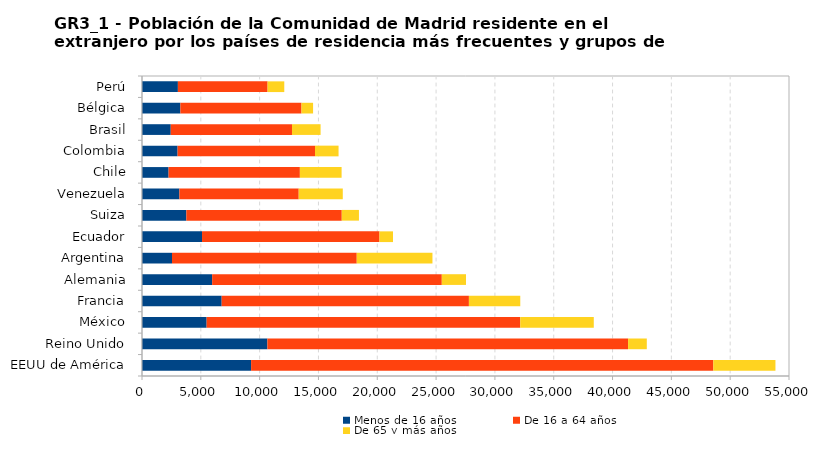
| Category | Menos de 16 años | De 16 a 64 años | De 65 y más años |
|---|---|---|---|
| EEUU de América | 9274 | 39294 | 5280 |
|     Reino Unido | 10660 | 30661 | 1591 |
|     México | 5495 | 26661 | 6249 |
|     Francia | 6774 | 21016 | 4366 |
|     Alemania | 5963 | 19522 | 2058 |
|     Argentina | 2549 | 15707 | 6435 |
|     Ecuador | 5102 | 15086 | 1151 |
|     Suiza | 3770 | 13211 | 1462 |
|     Venezuela | 3178 | 10143 | 3747 |
|     Chile | 2260 | 11160 | 3548 |
|     Colombia | 3026 | 11682 | 2001 |
|     Brasil | 2444 | 10306 | 2432 |
|     Bélgica | 3263 | 10295 | 985 |
|     Perú | 3051 | 7625 | 1419 |